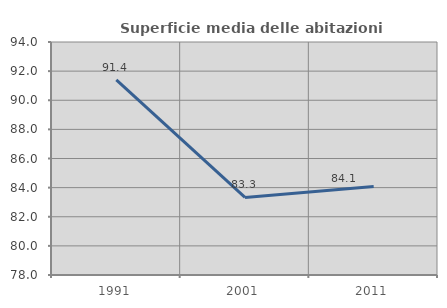
| Category | Superficie media delle abitazioni occupate |
|---|---|
| 1991.0 | 91.393 |
| 2001.0 | 83.328 |
| 2011.0 | 84.071 |